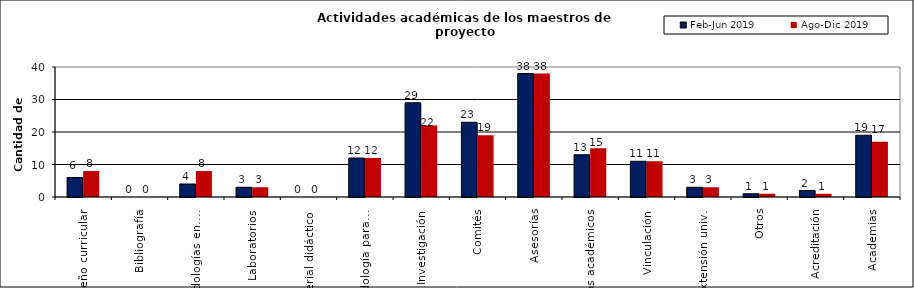
| Category | Feb-Jun 2019 | Ago-Dic 2019 |
|---|---|---|
| Diseño curricular | 6 | 8 |
| Bibliografía | 0 | 0 |
| Metodologías en.... | 4 | 8 |
| Laboratorios | 3 | 3 |
| Material didáctico | 0 | 0 |
| Metodología para... | 12 | 12 |
| Investigación | 29 | 22 |
| Comités | 23 | 19 |
| Asesorías | 38 | 38 |
| Clubs académicos | 13 | 15 |
| Vinculación | 11 | 11 |
| Extensión univ. | 3 | 3 |
| Otros | 1 | 1 |
| Acreditación | 2 | 1 |
| Academias | 19 | 17 |